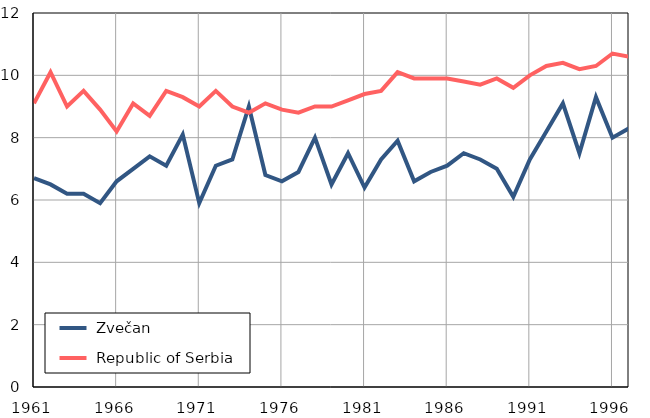
| Category |  Zvečan |  Republic of Serbia |
|---|---|---|
| 1961.0 | 6.7 | 9.1 |
| 1962.0 | 6.5 | 10.1 |
| 1963.0 | 6.2 | 9 |
| 1964.0 | 6.2 | 9.5 |
| 1965.0 | 5.9 | 8.9 |
| 1966.0 | 6.6 | 8.2 |
| 1967.0 | 7 | 9.1 |
| 1968.0 | 7.4 | 8.7 |
| 1969.0 | 7.1 | 9.5 |
| 1970.0 | 8.1 | 9.3 |
| 1971.0 | 5.9 | 9 |
| 1972.0 | 7.1 | 9.5 |
| 1973.0 | 7.3 | 9 |
| 1974.0 | 9 | 8.8 |
| 1975.0 | 6.8 | 9.1 |
| 1976.0 | 6.6 | 8.9 |
| 1977.0 | 6.9 | 8.8 |
| 1978.0 | 8 | 9 |
| 1979.0 | 6.5 | 9 |
| 1980.0 | 7.5 | 9.2 |
| 1981.0 | 6.4 | 9.4 |
| 1982.0 | 7.3 | 9.5 |
| 1983.0 | 7.9 | 10.1 |
| 1984.0 | 6.6 | 9.9 |
| 1985.0 | 6.9 | 9.9 |
| 1986.0 | 7.1 | 9.9 |
| 1987.0 | 7.5 | 9.8 |
| 1988.0 | 7.3 | 9.7 |
| 1989.0 | 7 | 9.9 |
| 1990.0 | 6.1 | 9.6 |
| 1991.0 | 7.3 | 10 |
| 1992.0 | 8.2 | 10.3 |
| 1993.0 | 9.1 | 10.4 |
| 1994.0 | 7.5 | 10.2 |
| 1995.0 | 9.3 | 10.3 |
| 1996.0 | 8 | 10.7 |
| 1997.0 | 8.3 | 10.6 |